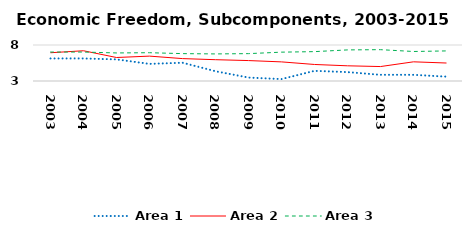
| Category | Area 1 | Area 2 | Area 3 |
|---|---|---|---|
| 2003.0 | 6.131 | 6.926 | 7.021 |
| 2004.0 | 6.131 | 7.2 | 7.022 |
| 2005.0 | 5.999 | 6.263 | 6.896 |
| 2006.0 | 5.378 | 6.455 | 6.929 |
| 2007.0 | 5.539 | 6.111 | 6.803 |
| 2008.0 | 4.355 | 5.959 | 6.761 |
| 2009.0 | 3.476 | 5.837 | 6.802 |
| 2010.0 | 3.265 | 5.656 | 7.007 |
| 2011.0 | 4.409 | 5.295 | 7.079 |
| 2012.0 | 4.236 | 5.11 | 7.318 |
| 2013.0 | 3.86 | 5.006 | 7.352 |
| 2014.0 | 3.861 | 5.664 | 7.098 |
| 2015.0 | 3.602 | 5.497 | 7.178 |